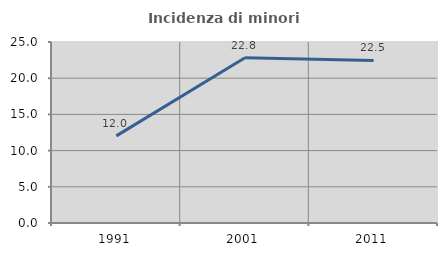
| Category | Incidenza di minori stranieri |
|---|---|
| 1991.0 | 12.037 |
| 2001.0 | 22.821 |
| 2011.0 | 22.46 |